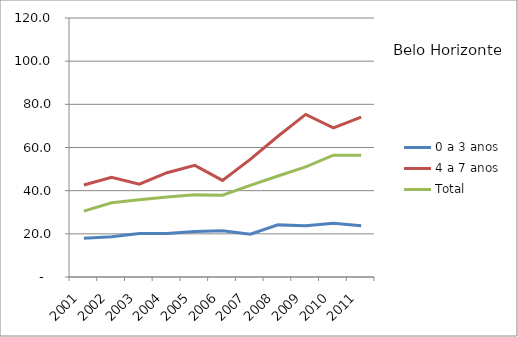
| Category | 0 a 3 anos | 4 a 7 anos | Total |
|---|---|---|---|
| 2001.0 | 17.96 | 42.61 | 30.55 |
| 2002.0 | 18.6 | 46.16 | 34.38 |
| 2003.0 | 20.13 | 42.98 | 35.76 |
| 2004.0 | 20.12 | 48.31 | 37.02 |
| 2005.0 | 21.04 | 51.71 | 38.05 |
| 2006.0 | 21.48 | 44.75 | 37.92 |
| 2007.0 | 19.8 | 54.52 | 42.42 |
| 2008.0 | 24.15 | 65.21 | 46.81 |
| 2009.0 | 23.73 | 75.33 | 50.99 |
| 2010.0 | 24.93 | 69.05 | 56.42 |
| 2011.0 | 23.7 | 74.05 | 56.38 |